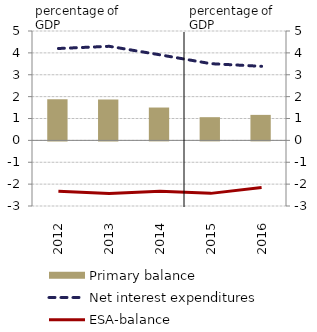
| Category | Primary balance |
|---|---|
| 2012.0 | 1.879 |
| 2013.0 | 1.873 |
| 2014.0 | 1.502 |
| 2015.0 | 1.06 |
| 2016.0 | 1.166 |